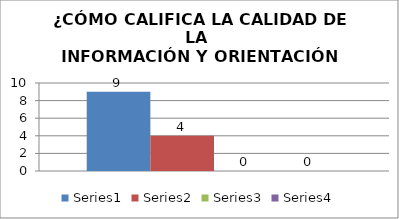
| Category | Series 0 | Series 1 | Series 2 | Series 3 |
|---|---|---|---|---|
| 0 | 9 | 4 | 0 | 0 |